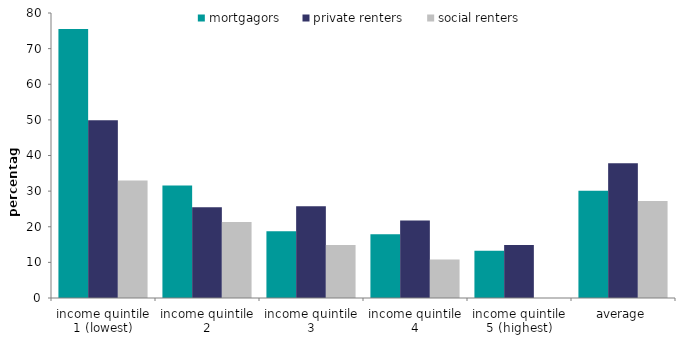
| Category | mortgagors | private renters | social renters |
|---|---|---|---|
| income quintile 1 (lowest) | 75.492 | 49.907 | 33.004 |
| income quintile 2 | 31.61 | 25.505 | 21.313 |
| income quintile 3 | 18.708 | 25.743 | 14.895 |
| income quintile 4 | 17.861 | 21.788 | 10.828 |
| income quintile 5 (highest) | 13.289 | 14.859 | 0 |
| average | 30.1 | 37.8 | 27.2 |